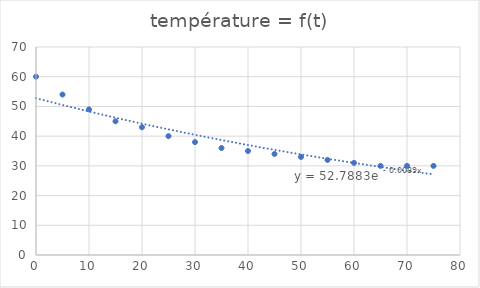
| Category | température = f(t) |
|---|---|
| 0.0 | 60 |
| 5.0 | 54 |
| 10.0 | 49 |
| 15.0 | 45 |
| 20.0 | 43 |
| 25.0 | 40 |
| 30.0 | 38 |
| 35.0 | 36 |
| 40.0 | 35 |
| 45.0 | 34 |
| 50.0 | 33 |
| 55.0 | 32 |
| 60.0 | 31 |
| 65.0 | 30 |
| 70.0 | 30 |
| 75.0 | 30 |